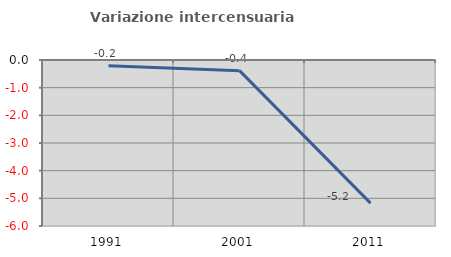
| Category | Variazione intercensuaria annua |
|---|---|
| 1991.0 | -0.212 |
| 2001.0 | -0.386 |
| 2011.0 | -5.174 |